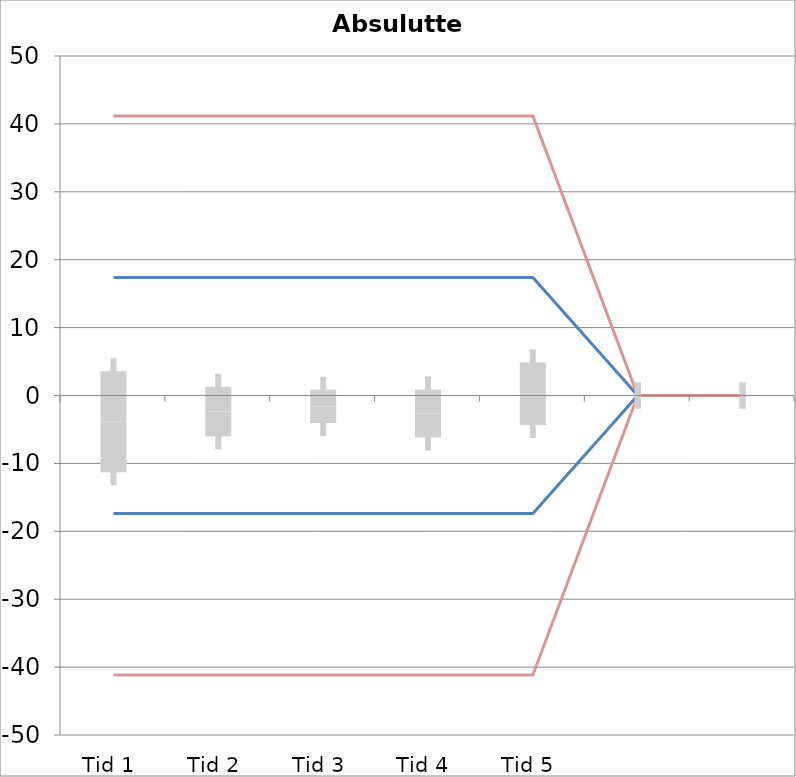
| Category | 1 | 2 | 3 | 4 | 5 | 6 | 7 | 8 | 9 | 10 | 11 | 12 | 13 | 14 | 15 | 16 | 17 | 18 | 19 | 20 | TEa | B | -B | -TEa | M |
|---|---|---|---|---|---|---|---|---|---|---|---|---|---|---|---|---|---|---|---|---|---|---|---|---|---|
| Tid 1 | -0.3 | 4.3 | -0.6 | 0.6 | -1.2 | -0.8 | -32.2 | -0.2 | -7.9 | -0.4 | 0 | 0 | 0 | 0 | 0 | 0 | 0 | 0 | 0 | 0 | 41.166 | 17.394 | -17.394 | -41.166 | -3.87 |
| Tid 2 | -0.3 | 0.9 | 0.7 | 1.4 | -0.7 | -1.1 | -15.2 | -0.2 | -7.1 | -2.1 | 0 | 0 | 0 | 0 | 0 | 0 | 0 | 0 | 0 | 0 | 41.166 | 17.394 | -17.394 | -41.166 | -2.37 |
| Tid 3 | -0.2 | 1.5 | 0.1 | 0.9 | -1.2 | -1.7 | -10.4 | 0 | -3.7 | -1.3 | 0 | 0 | 0 | 0 | 0 | 0 | 0 | 0 | 0 | 0 | 41.166 | 17.394 | -17.394 | -41.166 | -1.6 |
| Tid 4 | 0.1 | 0 | -0.4 | 0.8 | -1.1 | -2 | -11.9 | 0 | -5.7 | -1 | 0 | 0 | 0 | 0 | 0 | 0 | 0 | 0 | 0 | 0 | 41.166 | 17.394 | -17.394 | -41.166 | -2.65 |
| Tid 5 | 0.2 | 0 | -0.7 | 1.7 | -0.5 | -1 | 12.2 | 0 | -7.4 | -2.4 | 0 | 0 | 0 | 0 | 0 | 0 | 0 | 0 | 0 | 0 | 41.166 | 17.394 | -17.394 | -41.166 | 0.262 |